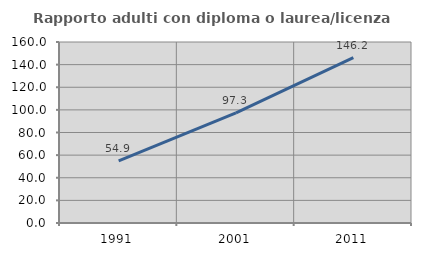
| Category | Rapporto adulti con diploma o laurea/licenza media  |
|---|---|
| 1991.0 | 54.922 |
| 2001.0 | 97.311 |
| 2011.0 | 146.218 |